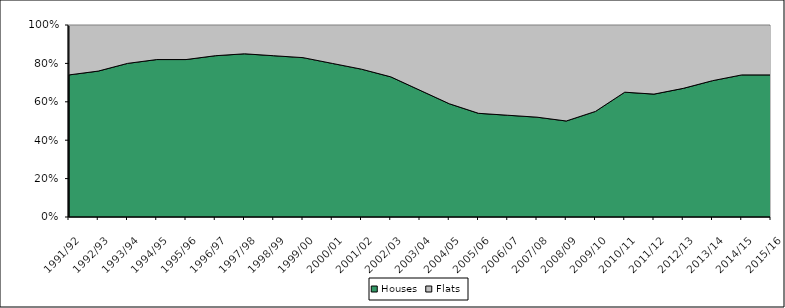
| Category | Houses | Flats |
|---|---|---|
| 1991/92 | 74 | 26 |
| 1992/93 | 76 | 24 |
| 1993/94 | 80 | 20 |
| 1994/95 | 82 | 18 |
| 1995/96 | 82 | 18 |
| 1996/97 | 84 | 16 |
| 1997/98 | 85 | 15 |
| 1998/99 | 84 | 16 |
| 1999/00 | 83 | 17 |
| 2000/01 | 80 | 20 |
| 2001/02 | 77 | 23 |
| 2002/03 | 73 | 27 |
| 2003/04 | 66 | 34 |
| 2004/05 | 59 | 41 |
| 2005/06 | 54 | 46 |
| 2006/07 | 53 | 47 |
| 2007/08 | 52 | 48 |
| 2008/09 | 50 | 50 |
| 2009/10 | 55 | 45 |
| 2010/11 | 65 | 35 |
| 2011/12 | 64 | 36 |
| 2012/13 | 67 | 33 |
| 2013/14 | 71 | 29 |
| 2014/15 | 74 | 26 |
| 2015/16 | 74 | 26 |